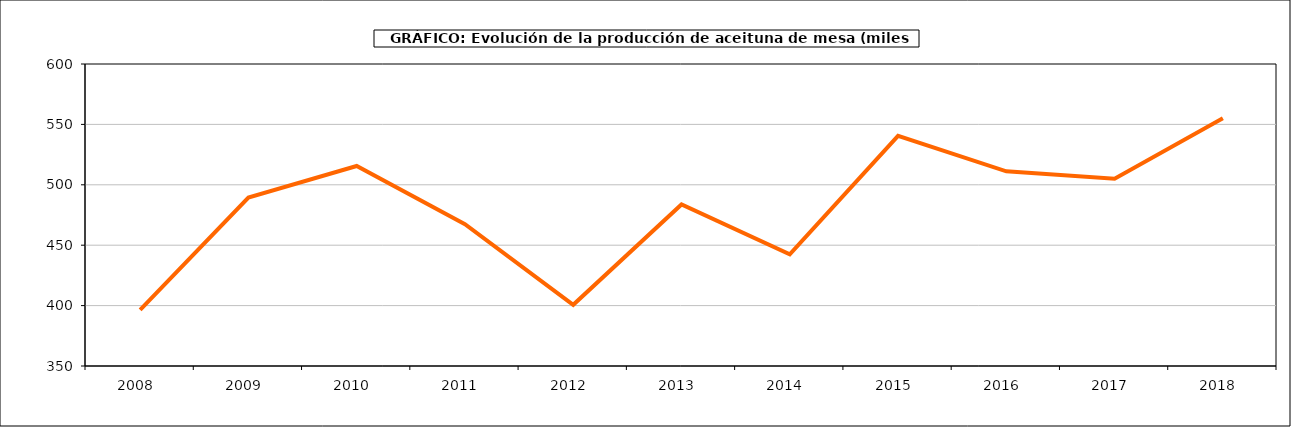
| Category | producción |
|---|---|
| 2008.0 | 396.432 |
| 2009.0 | 489.368 |
| 2010.0 | 515.591 |
| 2011.0 | 467.363 |
| 2012.0 | 400.651 |
| 2013.0 | 483.713 |
| 2014.0 | 442.478 |
| 2015.0 | 540.484 |
| 2016.0 | 511.122 |
| 2017.0 | 505.046 |
| 2018.0 | 555.033 |